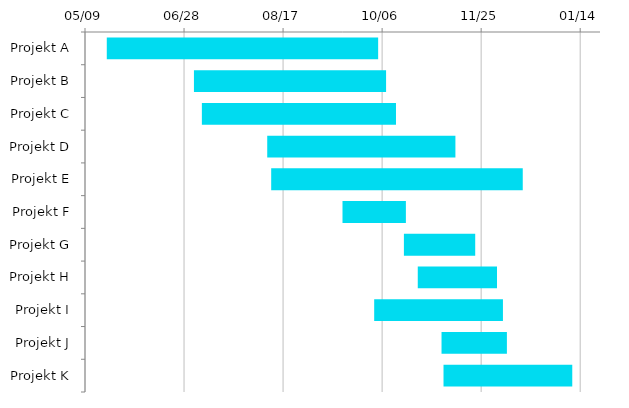
| Category | Anfang | Tage |
|---|---|---|
| Projekt A | 2022-05-20 | 137 |
| Projekt B | 2022-07-03 | 97 |
| Projekt C | 2022-07-07 | 98 |
| Projekt D | 2022-08-09 | 95 |
| Projekt E | 2022-08-11 | 127 |
| Projekt F | 2022-09-16 | 32 |
| Projekt G | 2022-10-17 | 36 |
| Projekt H | 2022-10-24 | 40 |
| Projekt I | 2022-10-02 | 65 |
| Projekt J | 2022-11-05 | 33 |
| Projekt K | 2022-11-06 | 65 |